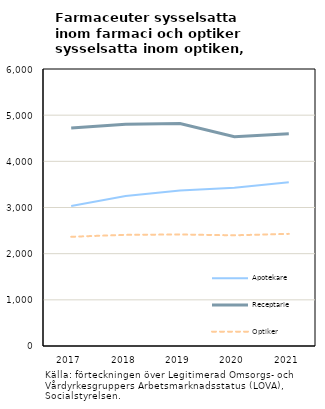
| Category | Apotekare | Receptarie | Optiker |
|---|---|---|---|
| 2017.0 | 3034 | 4720 | 2366 |
| 2018.0 | 3247 | 4801 | 2408 |
| 2019.0 | 3366 | 4818 | 2416 |
| 2020.0 | 3430 | 4534 | 2398 |
| 2021.0 | 3548 | 4598 | 2429 |